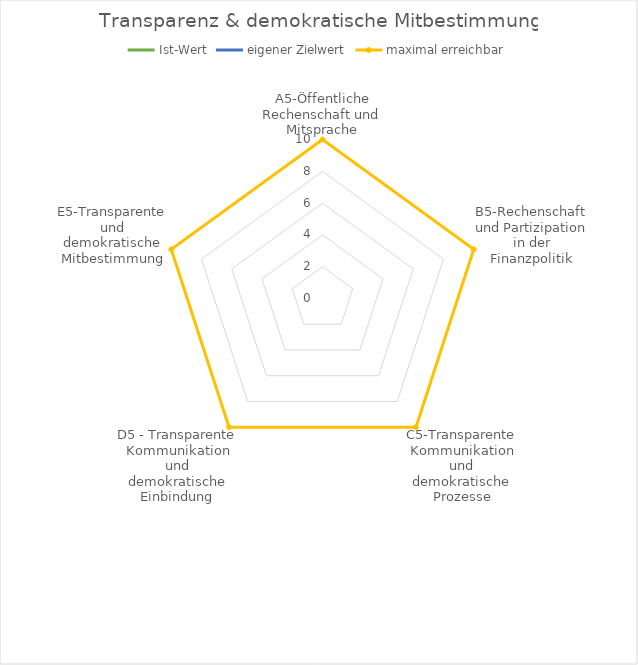
| Category | Ist-Wert | eigener Zielwert | maximal erreichbar |
|---|---|---|---|
| A5-Öffentliche Rechenschaft und Mitsprache | 0 | 0 | 10 |
| B5-Rechenschaft und Partizipation in der Finanzpolitik | 0 | 0 | 10 |
| C5-Transparente Kommunikation und demokratische Prozesse | 0 | 0 | 10 |
| D5 - Transparente Kommunikation und demokratische Einbindung | 0 | 0 | 10 |
| E5-Transparente und demokratische Mitbestimmung | 0 | 0 | 10 |